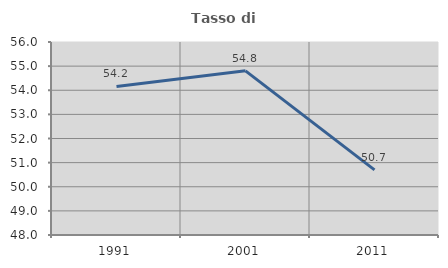
| Category | Tasso di occupazione   |
|---|---|
| 1991.0 | 54.158 |
| 2001.0 | 54.805 |
| 2011.0 | 50.7 |